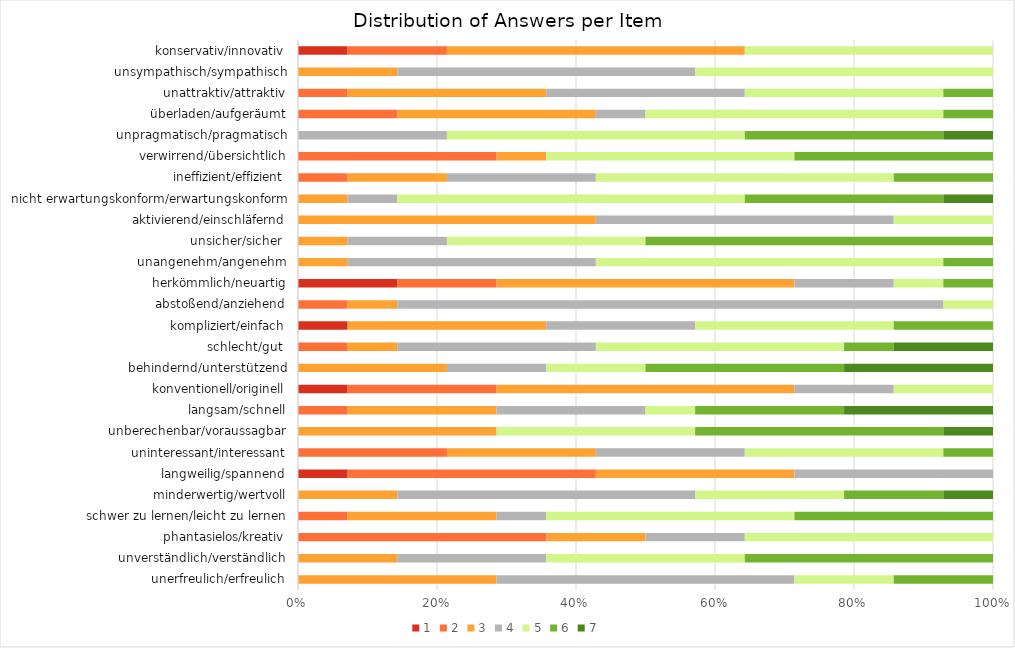
| Category | 1 | 2 | 3 | 4 | 5 | 6 | 7 |
|---|---|---|---|---|---|---|---|
| unerfreulich/erfreulich | 0 | 0 | 4 | 6 | 2 | 2 | 0 |
| unverständlich/verständlich | 0 | 0 | 2 | 3 | 4 | 5 | 0 |
| phantasielos/kreativ | 0 | 5 | 2 | 2 | 5 | 0 | 0 |
| schwer zu lernen/leicht zu lernen | 0 | 1 | 3 | 1 | 5 | 4 | 0 |
| minderwertig/wertvoll | 0 | 0 | 2 | 6 | 3 | 2 | 1 |
| langweilig/spannend | 1 | 5 | 4 | 4 | 0 | 0 | 0 |
| uninteressant/interessant | 0 | 3 | 3 | 3 | 4 | 1 | 0 |
| unberechenbar/voraussagbar | 0 | 0 | 4 | 0 | 4 | 5 | 1 |
| langsam/schnell | 0 | 1 | 3 | 3 | 1 | 3 | 3 |
| konventionell/originell | 1 | 3 | 6 | 2 | 2 | 0 | 0 |
| behindernd/unterstützend | 0 | 0 | 3 | 2 | 2 | 4 | 3 |
| schlecht/gut  | 0 | 1 | 1 | 4 | 5 | 1 | 2 |
| kompliziert/einfach | 1 | 0 | 4 | 3 | 4 | 2 | 0 |
| abstoßend/anziehend | 0 | 1 | 1 | 11 | 1 | 0 | 0 |
| herkömmlich/neuartig | 2 | 2 | 6 | 2 | 1 | 1 | 0 |
| unangenehm/angenehm | 0 | 0 | 1 | 5 | 7 | 1 | 0 |
| unsicher/sicher  | 0 | 0 | 1 | 2 | 4 | 7 | 0 |
| aktivierend/einschläfernd | 0 | 0 | 6 | 6 | 2 | 0 | 0 |
| nicht erwartungskonform/erwartungskonform | 0 | 0 | 1 | 1 | 7 | 4 | 1 |
| ineffizient/effizient | 0 | 1 | 2 | 3 | 6 | 2 | 0 |
| verwirrend/übersichtlich | 0 | 4 | 1 | 0 | 5 | 4 | 0 |
| unpragmatisch/pragmatisch | 0 | 0 | 0 | 3 | 6 | 4 | 1 |
| überladen/aufgeräumt | 0 | 2 | 4 | 1 | 6 | 1 | 0 |
| unattraktiv/attraktiv | 0 | 1 | 4 | 4 | 4 | 1 | 0 |
| unsympathisch/sympathisch | 0 | 0 | 2 | 6 | 6 | 0 | 0 |
| konservativ/innovativ | 1 | 2 | 6 | 0 | 5 | 0 | 0 |